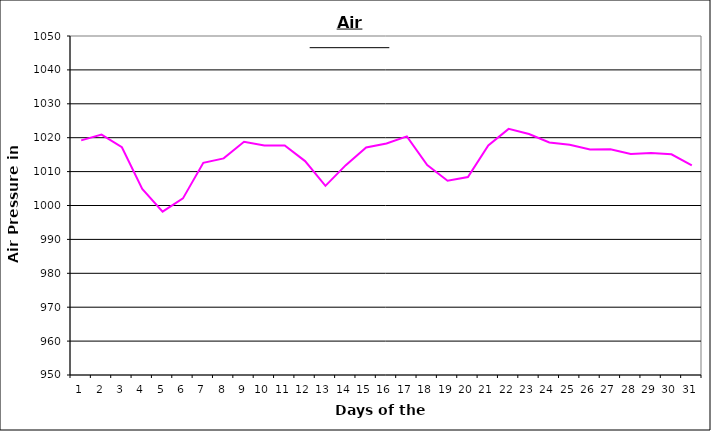
| Category | Series 0 |
|---|---|
| 0 | 1019.2 |
| 1 | 1020.9 |
| 2 | 1017.2 |
| 3 | 1004.9 |
| 4 | 998.2 |
| 5 | 1002.1 |
| 6 | 1012.6 |
| 7 | 1013.9 |
| 8 | 1018.8 |
| 9 | 1017.7 |
| 10 | 1017.7 |
| 11 | 1013.1 |
| 12 | 1005.8 |
| 13 | 1011.9 |
| 14 | 1017.1 |
| 15 | 1018.3 |
| 16 | 1020.4 |
| 17 | 1011.9 |
| 18 | 1007.3 |
| 19 | 1008.4 |
| 20 | 1017.7 |
| 21 | 1022.6 |
| 22 | 1021.1 |
| 23 | 1018.6 |
| 24 | 1017.9 |
| 25 | 1016.5 |
| 26 | 1016.6 |
| 27 | 1015.2 |
| 28 | 1015.5 |
| 29 | 1015.1 |
| 30 | 1011.8 |